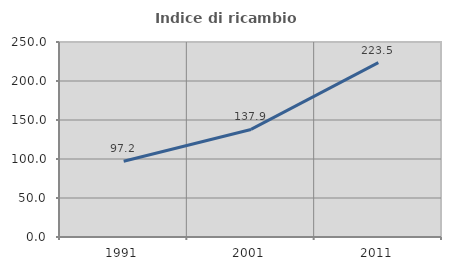
| Category | Indice di ricambio occupazionale  |
|---|---|
| 1991.0 | 97.152 |
| 2001.0 | 137.906 |
| 2011.0 | 223.513 |